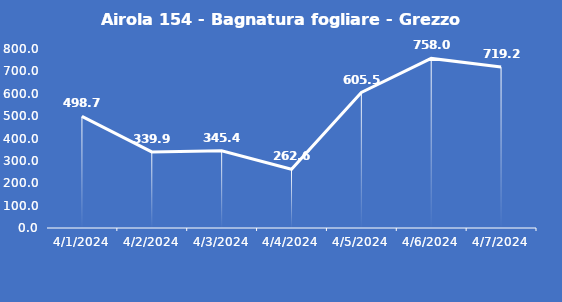
| Category | Airola 154 - Bagnatura fogliare - Grezzo (min) |
|---|---|
| 4/1/24 | 498.7 |
| 4/2/24 | 339.9 |
| 4/3/24 | 345.4 |
| 4/4/24 | 262.6 |
| 4/5/24 | 605.5 |
| 4/6/24 | 758 |
| 4/7/24 | 719.2 |